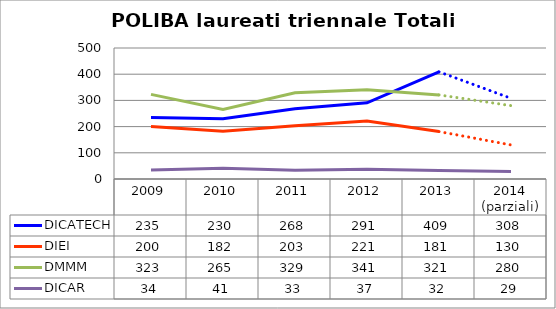
| Category | DICATECH | DIEI  | DMMM | DICAR |
|---|---|---|---|---|
| 2009 | 235 | 200 | 323 | 34 |
| 2010 | 230 | 182 | 265 | 41 |
| 2011 | 268 | 203 | 329 | 33 |
| 2012 | 291 | 221 | 341 | 37 |
| 2013 | 409 | 181 | 321 | 32 |
| 2014
(parziali) | 308 | 130 | 280 | 29 |